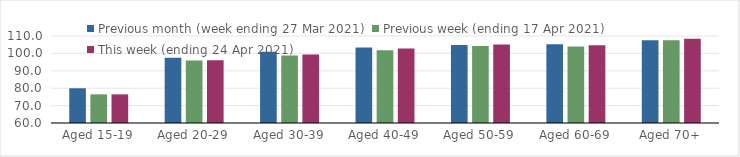
| Category | Previous month (week ending 27 Mar 2021) | Previous week (ending 17 Apr 2021) | This week (ending 24 Apr 2021) |
|---|---|---|---|
| Aged 15-19 | 79.96 | 76.47 | 76.46 |
| Aged 20-29 | 97.43 | 95.9 | 96.12 |
| Aged 30-39 | 100.9 | 98.86 | 99.33 |
| Aged 40-49 | 103.45 | 101.82 | 102.82 |
| Aged 50-59 | 104.86 | 104.25 | 105.11 |
| Aged 60-69 | 105.29 | 103.96 | 104.74 |
| Aged 70+ | 107.6 | 107.52 | 108.35 |